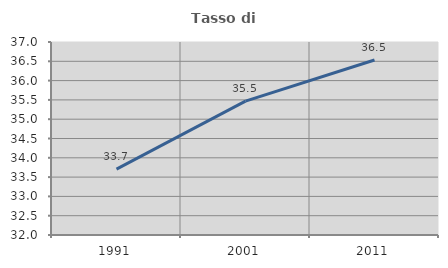
| Category | Tasso di occupazione   |
|---|---|
| 1991.0 | 33.707 |
| 2001.0 | 35.467 |
| 2011.0 | 36.533 |